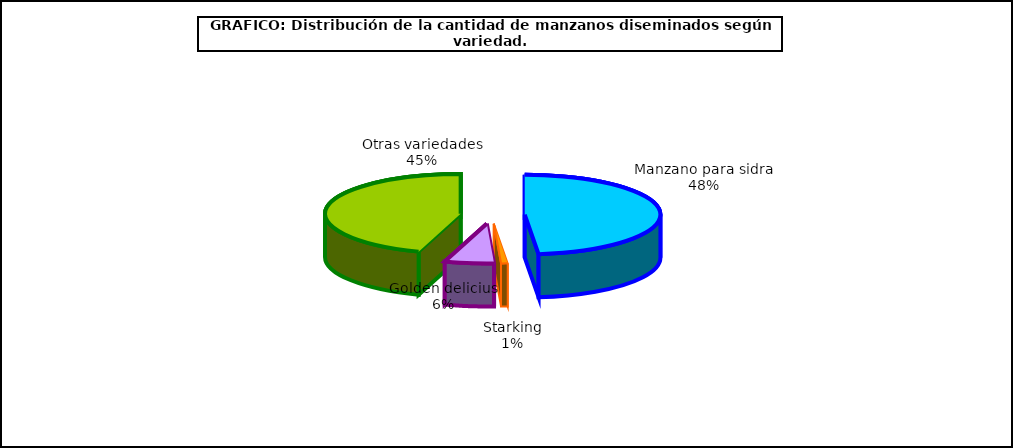
| Category | arboles |
|---|---|
| 0 | 695.078 |
| 1 | 11.029 |
| 2 | 84.395 |
| 3 | 646.366 |